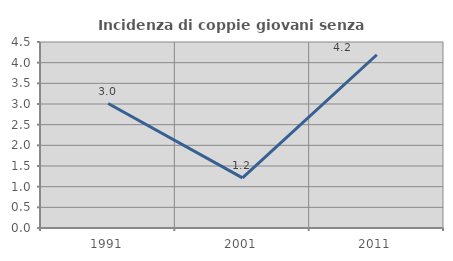
| Category | Incidenza di coppie giovani senza figli |
|---|---|
| 1991.0 | 3.012 |
| 2001.0 | 1.212 |
| 2011.0 | 4.192 |